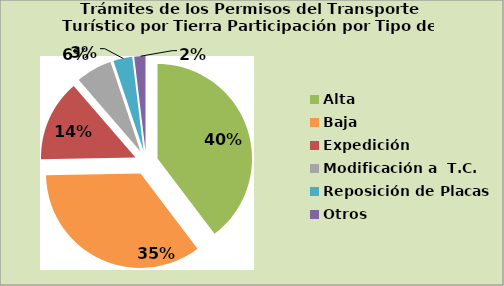
| Category | Series 0 |
|---|---|
| Alta                                         | 39.691 |
| Baja | 35.035 |
| Expedición | 13.946 |
| Modificación a  T.C. | 6.177 |
| Reposición de Placas | 3.242 |
| Otros | 1.91 |